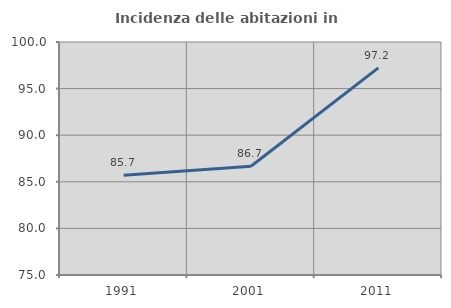
| Category | Incidenza delle abitazioni in proprietà  |
|---|---|
| 1991.0 | 85.714 |
| 2001.0 | 86.667 |
| 2011.0 | 97.222 |